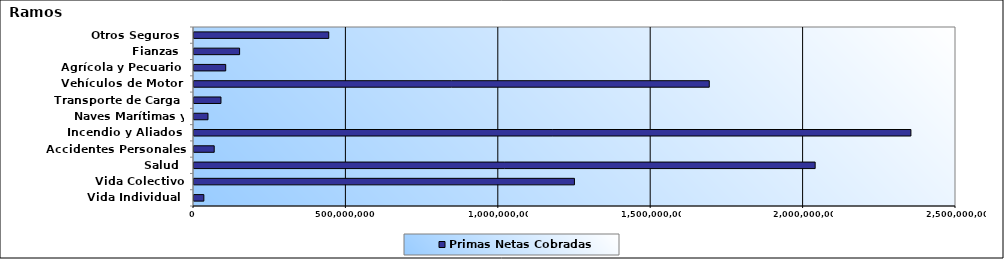
| Category | Primas Netas Cobradas |
|---|---|
| Vida Individual  | 32320657.72 |
| Vida Colectivo | 1248158331.62 |
| Salud  | 2037924228.4 |
| Accidentes Personales | 66328469.32 |
| Incendio y Aliados  | 2352085663.54 |
| Naves Marítimas y Aéreas  | 45917961.63 |
| Transporte de Carga  | 88441478.79 |
| Vehículos de Motor  | 1690537314.44 |
| Agrícola y Pecuario  | 104050765.77 |
| Fianzas  | 149635581.2 |
| Otros Seguros  | 442115802.27 |